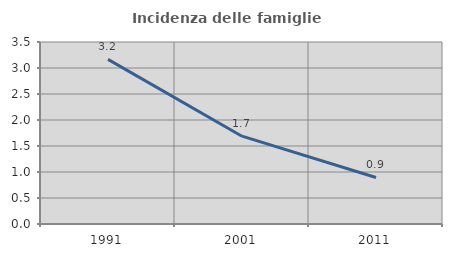
| Category | Incidenza delle famiglie numerose |
|---|---|
| 1991.0 | 3.166 |
| 2001.0 | 1.689 |
| 2011.0 | 0.895 |